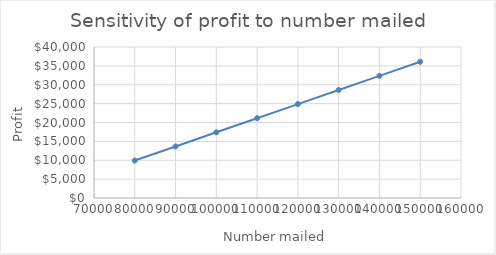
| Category | Series 0 |
|---|---|
| 80000.0 | 9920 |
| 90000.0 | 13660 |
| 100000.0 | 17400 |
| 110000.0 | 21140 |
| 120000.0 | 24880 |
| 130000.0 | 28620 |
| 140000.0 | 32360 |
| 150000.0 | 36100 |